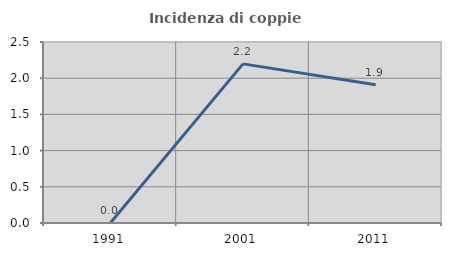
| Category | Incidenza di coppie miste |
|---|---|
| 1991.0 | 0 |
| 2001.0 | 2.198 |
| 2011.0 | 1.911 |